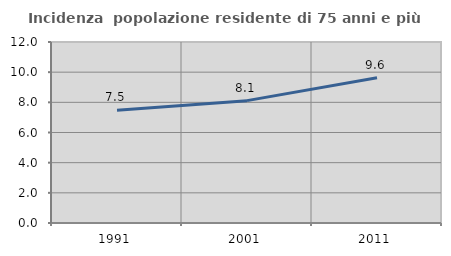
| Category | Incidenza  popolazione residente di 75 anni e più |
|---|---|
| 1991.0 | 7.483 |
| 2001.0 | 8.112 |
| 2011.0 | 9.63 |